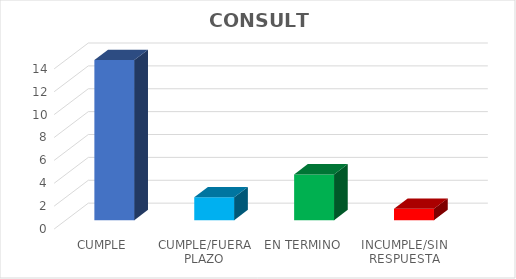
| Category | TOTAL |
|---|---|
| CUMPLE | 14 |
| CUMPLE/FUERA PLAZO | 2 |
| EN TERMINO | 4 |
| INCUMPLE/SIN RESPUESTA | 1 |